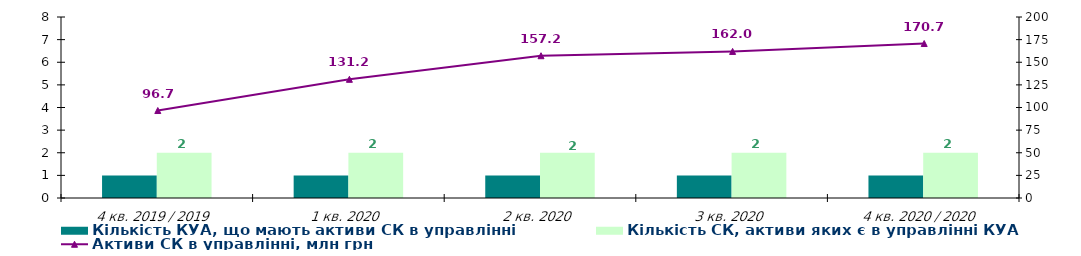
| Category | Кількість КУА, що мають активи СК в управлінні | Кількість СК, активи яких є в управлінні КУА |
|---|---|---|
| 4 кв. 2019 / 2019 | 1 | 2 |
| 1 кв. 2020 | 1 | 2 |
| 2 кв. 2020 | 1 | 2 |
| 3 кв. 2020 | 1 | 2 |
| 4 кв. 2020 / 2020 | 1 | 2 |